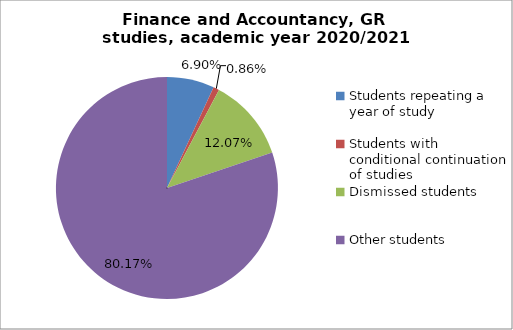
| Category | Series 0 |
|---|---|
| Students repeating a year of study | 8 |
| Students with conditional continuation of studies | 1 |
| Dismissed students | 14 |
| Other students | 93 |